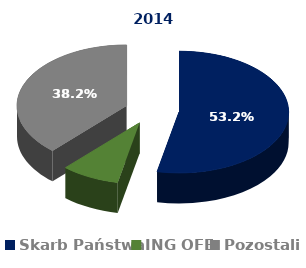
| Category | 2014 |
|---|---|
| Skarb Państwa | 0.532 |
| ING OFE | 0.086 |
| Pozostali | 0.382 |